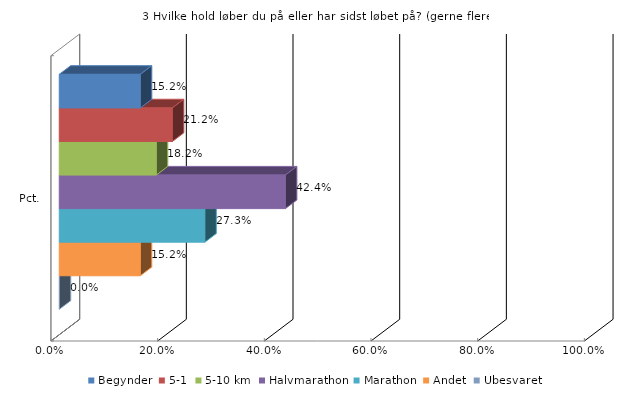
| Category | Begynder  | 5-1 | 5-10 km | Halvmarathon | Marathon | Andet | Ubesvaret |
|---|---|---|---|---|---|---|---|
| Pct. | 0.152 | 0.212 | 0.182 | 0.424 | 0.273 | 0.152 | 0 |